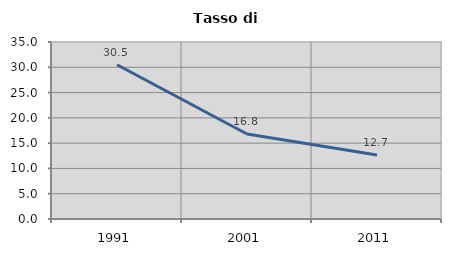
| Category | Tasso di disoccupazione   |
|---|---|
| 1991.0 | 30.499 |
| 2001.0 | 16.806 |
| 2011.0 | 12.671 |